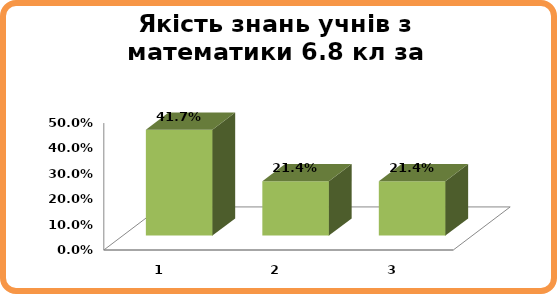
| Category | Series 0 |
|---|---|
| 0 | 0.417 |
| 1 | 0.214 |
| 2 | 0.214 |